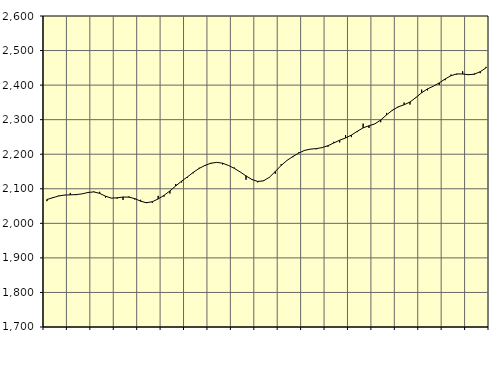
| Category | Piggar | Series 1 |
|---|---|---|
| nan | 2064.2 | 2068.97 |
| 1.0 | 2075.7 | 2074.08 |
| 1.0 | 2080.1 | 2079.1 |
| 1.0 | 2081.3 | 2081.82 |
| nan | 2088 | 2082.37 |
| 2.0 | 2081.6 | 2083.22 |
| 2.0 | 2085.2 | 2085.21 |
| 2.0 | 2087.8 | 2089.26 |
| nan | 2092.3 | 2090.95 |
| 3.0 | 2091.2 | 2086.73 |
| 3.0 | 2074.5 | 2078.58 |
| 3.0 | 2073.4 | 2072.97 |
| nan | 2071.7 | 2073.81 |
| 4.0 | 2067.8 | 2076.16 |
| 4.0 | 2077.8 | 2075.81 |
| 4.0 | 2069 | 2071.62 |
| nan | 2068.1 | 2064.11 |
| 5.0 | 2061.7 | 2059.54 |
| 5.0 | 2059.4 | 2062.64 |
| 5.0 | 2079.5 | 2070.58 |
| nan | 2077.3 | 2080.96 |
| 6.0 | 2086.3 | 2093.64 |
| 6.0 | 2113.9 | 2108.18 |
| 6.0 | 2118.3 | 2122.1 |
| nan | 2132.4 | 2134.39 |
| 7.0 | 2144.9 | 2147.58 |
| 7.0 | 2160.8 | 2158.97 |
| 7.0 | 2166.4 | 2167.66 |
| nan | 2171.9 | 2174.01 |
| 8.0 | 2176.8 | 2176.4 |
| 8.0 | 2170.3 | 2174.03 |
| 8.0 | 2168.4 | 2167.47 |
| nan | 2161.4 | 2159.15 |
| 9.0 | 2148.3 | 2148.66 |
| 9.0 | 2126.1 | 2137.26 |
| 9.0 | 2128 | 2126.98 |
| nan | 2118.7 | 2121.28 |
| 10.0 | 2124.3 | 2123.04 |
| 10.0 | 2133.9 | 2133.37 |
| 10.0 | 2143.7 | 2149.93 |
| nan | 2171.2 | 2167.48 |
| 11.0 | 2181.9 | 2182.09 |
| 11.0 | 2191.3 | 2193.44 |
| 11.0 | 2205.3 | 2203.34 |
| nan | 2210 | 2211.07 |
| 12.0 | 2214.2 | 2214.77 |
| 12.0 | 2214.3 | 2216.24 |
| 12.0 | 2218.9 | 2219.16 |
| nan | 2221.7 | 2224.67 |
| 13.0 | 2236 | 2232.63 |
| 13.0 | 2234.1 | 2240.58 |
| 13.0 | 2255.3 | 2247 |
| nan | 2249.5 | 2255.42 |
| 14.0 | 2264.1 | 2266.28 |
| 14.0 | 2288.5 | 2276.31 |
| 14.0 | 2276 | 2282.31 |
| nan | 2288.3 | 2287.77 |
| 15.0 | 2292.7 | 2298.96 |
| 15.0 | 2319.5 | 2313.76 |
| 15.0 | 2326 | 2327.27 |
| nan | 2335.8 | 2337.21 |
| 16.0 | 2349.6 | 2343.05 |
| 16.0 | 2343.8 | 2351.06 |
| 16.0 | 2362.7 | 2363.76 |
| nan | 2387 | 2377.9 |
| 17.0 | 2384.7 | 2389.09 |
| 17.0 | 2396.8 | 2396.89 |
| 17.0 | 2400.5 | 2406.37 |
| nan | 2414.2 | 2417.7 |
| 18.0 | 2430.6 | 2427.18 |
| 18.0 | 2430.7 | 2432.39 |
| 18.0 | 2440 | 2432.12 |
| nan | 2429.1 | 2430.13 |
| 19.0 | 2433.7 | 2431.44 |
| 19.0 | 2434.6 | 2438.81 |
| 19.0 | 2452.8 | 2449.94 |